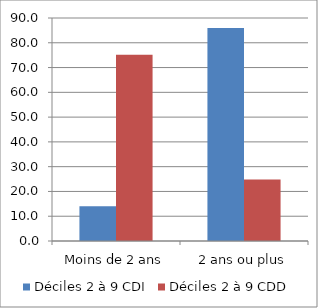
| Category | Déciles 2 à 9 CDI | Déciles 2 à 9 CDD |
|---|---|---|
| Moins de 2 ans | 14.007 | 75.129 |
| 2 ans ou plus | 85.993 | 24.871 |